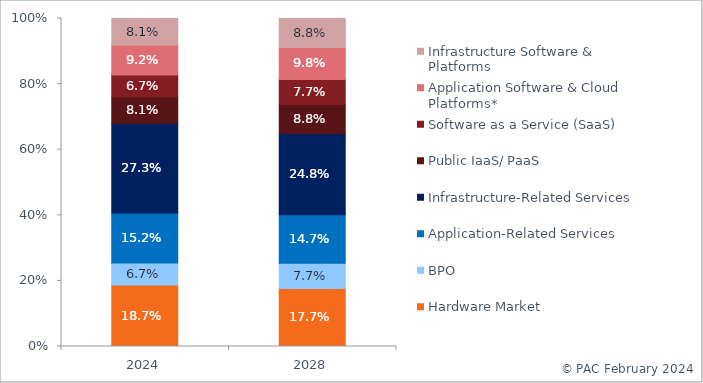
| Category | Hardware Market | BPO | Application-Related Services | Infrastructure-Related Services | Public IaaS/ PaaS | Software as a Service (SaaS) | Application Software & Cloud Platforms* | Infrastructure Software & Platforms |
|---|---|---|---|---|---|---|---|---|
| 2024.0 | 0.187 | 0.067 | 0.152 | 0.273 | 0.081 | 0.067 | 0.092 | 0.081 |
| 2028.0 | 0.177 | 0.077 | 0.147 | 0.248 | 0.088 | 0.077 | 0.098 | 0.088 |